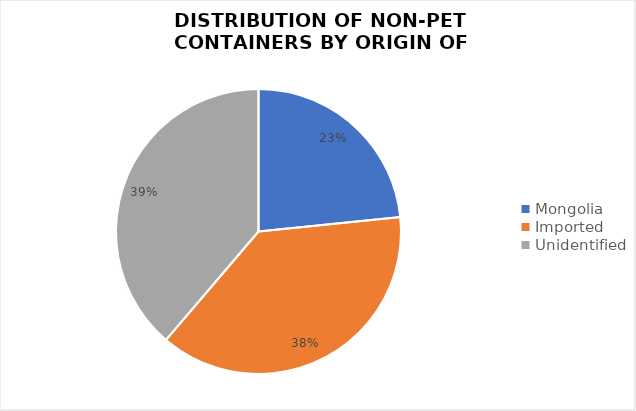
| Category | Series 0 |
|---|---|
| Mongolia | 257 |
| Imported | 416 |
| Unidentified | 426 |